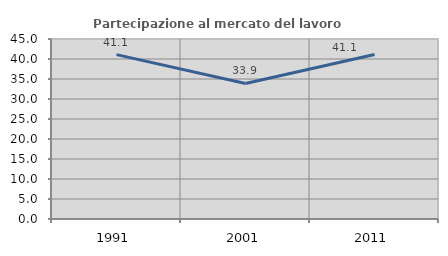
| Category | Partecipazione al mercato del lavoro  femminile |
|---|---|
| 1991.0 | 41.093 |
| 2001.0 | 33.879 |
| 2011.0 | 41.139 |